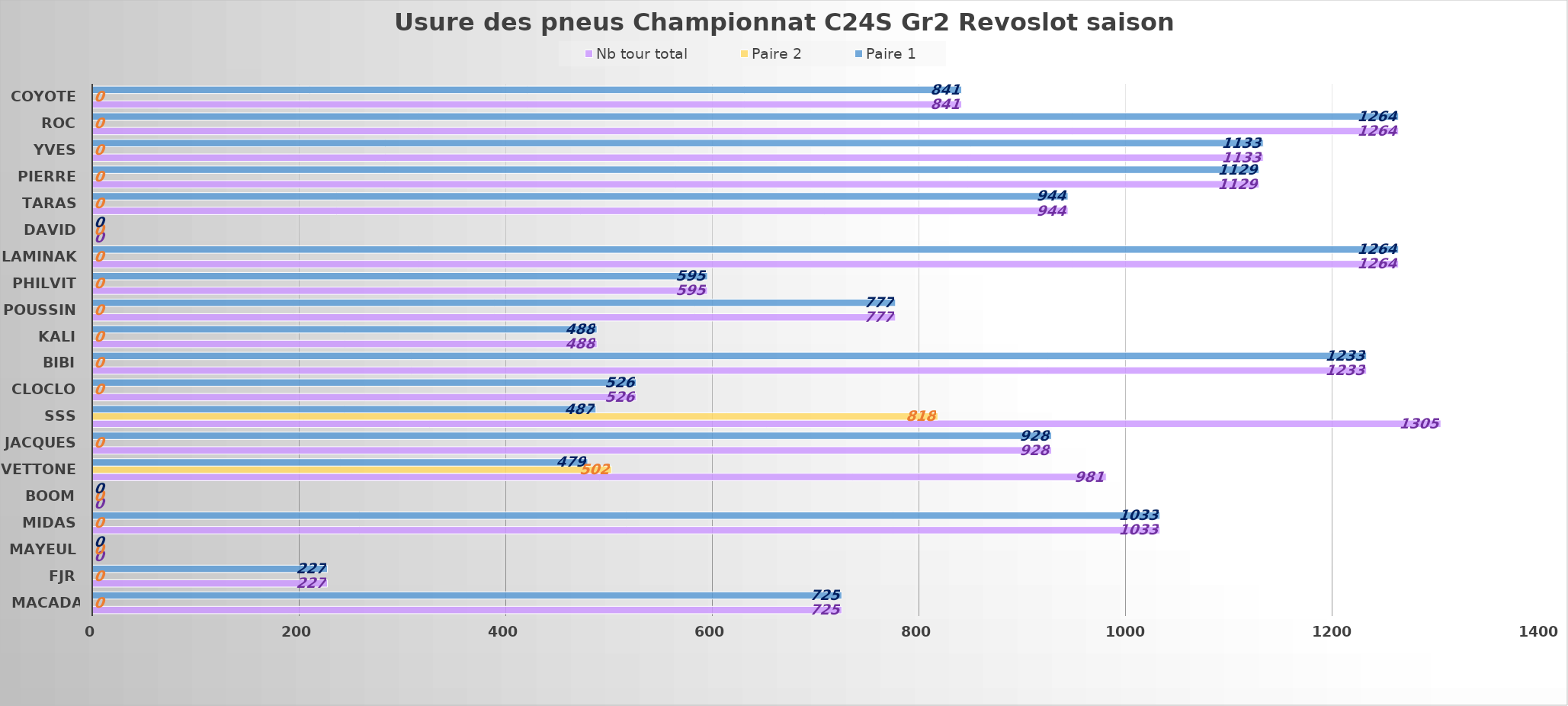
| Category | Nb tour total | Paire 2 | Paire 1 |
|---|---|---|---|
| Macadam | 725 | 0 | 725 |
| FJR | 227 | 0 | 227 |
| Mayeul | 0 | 0 | 0 |
| Midas | 1033 | 0 | 1033 |
| Boom | 0 | 0 | 0 |
| VettOne | 981 | 502 | 479 |
| Jacques | 928 | 0 | 928 |
| SSS | 1305 | 818 | 487 |
| Cloclo | 526 | 0 | 526 |
| Bibi | 1233 | 0 | 1233 |
| Kali | 488 | 0 | 488 |
| Poussin | 777 | 0 | 777 |
| Philvit | 595 | 0 | 595 |
| Laminak | 1264 | 0 | 1264 |
| David | 0 | 0 | 0 |
| Taras | 944 | 0 | 944 |
| Pierre | 1129 | 0 | 1129 |
| Yves | 1133 | 0 | 1133 |
| Roc | 1264 | 0 | 1264 |
| Coyote | 841 | 0 | 841 |